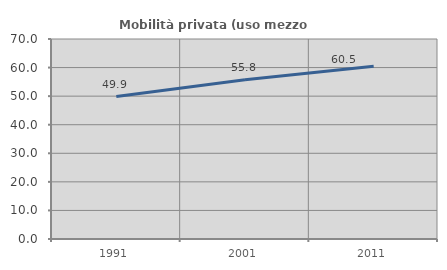
| Category | Mobilità privata (uso mezzo privato) |
|---|---|
| 1991.0 | 49.854 |
| 2001.0 | 55.764 |
| 2011.0 | 60.495 |